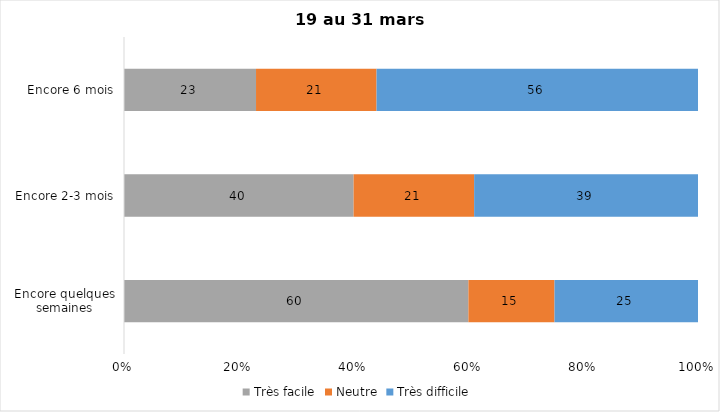
| Category | Très facile | Neutre | Très difficile |
|---|---|---|---|
| Encore quelques semaines | 60 | 15 | 25 |
| Encore 2-3 mois | 40 | 21 | 39 |
| Encore 6 mois | 23 | 21 | 56 |